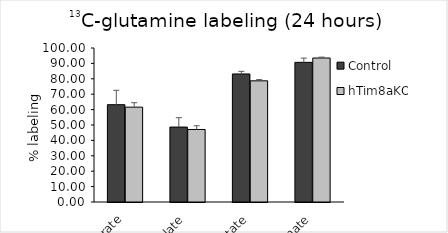
| Category | Control | hTim8aKO |
|---|---|---|
| Fumarate | 63.197 | 61.587 |
| Malate | 48.651 | 47.098 |
| Aspartate | 83.152 | 78.693 |
| Glutamate | 90.683 | 93.513 |